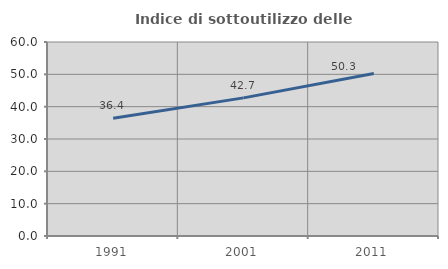
| Category | Indice di sottoutilizzo delle abitazioni  |
|---|---|
| 1991.0 | 36.416 |
| 2001.0 | 42.714 |
| 2011.0 | 50.279 |